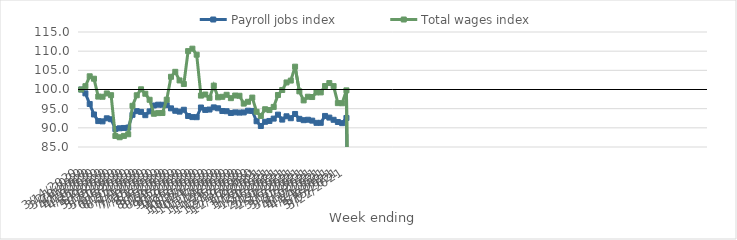
| Category | Payroll jobs index | Total wages index |
|---|---|---|
| 14/03/2020 | 100 | 100 |
| 21/03/2020 | 98.991 | 100.867 |
| 28/03/2020 | 96.222 | 103.446 |
| 04/04/2020 | 93.484 | 102.815 |
| 11/04/2020 | 91.759 | 98.149 |
| 18/04/2020 | 91.688 | 98.106 |
| 25/04/2020 | 92.484 | 98.97 |
| 02/05/2020 | 92.243 | 98.519 |
| 09/05/2020 | 89.688 | 87.883 |
| 16/05/2020 | 89.883 | 87.545 |
| 23/05/2020 | 89.967 | 87.89 |
| 30/05/2020 | 90.07 | 88.321 |
| 06/06/2020 | 93.39 | 95.741 |
| 13/06/2020 | 94.352 | 98.498 |
| 20/06/2020 | 94.165 | 100.051 |
| 27/06/2020 | 93.3 | 98.888 |
| 04/07/2020 | 94.297 | 97.32 |
| 11/07/2020 | 95.822 | 93.671 |
| 18/07/2020 | 96.036 | 93.842 |
| 25/07/2020 | 96.019 | 93.864 |
| 01/08/2020 | 95.918 | 97.336 |
| 08/08/2020 | 95.08 | 103.315 |
| 15/08/2020 | 94.451 | 104.61 |
| 22/08/2020 | 94.231 | 102.366 |
| 29/08/2020 | 94.715 | 101.438 |
| 05/09/2020 | 93.083 | 110.018 |
| 12/09/2020 | 92.801 | 110.647 |
| 19/09/2020 | 92.774 | 109.078 |
| 26/09/2020 | 95.302 | 98.406 |
| 03/10/2020 | 94.674 | 98.692 |
| 10/10/2020 | 94.774 | 97.81 |
| 17/10/2020 | 95.334 | 101.009 |
| 24/10/2020 | 95.1 | 97.95 |
| 31/10/2020 | 94.392 | 98.094 |
| 07/11/2020 | 94.329 | 98.62 |
| 14/11/2020 | 93.874 | 97.741 |
| 21/11/2020 | 94.03 | 98.43 |
| 28/11/2020 | 93.974 | 98.365 |
| 05/12/2020 | 94.02 | 96.321 |
| 12/12/2020 | 94.467 | 96.796 |
| 19/12/2020 | 94.411 | 97.891 |
| 26/12/2020 | 91.723 | 94.184 |
| 02/01/2021 | 90.483 | 93.102 |
| 09/01/2021 | 91.578 | 94.849 |
| 16/01/2021 | 91.791 | 94.631 |
| 23/01/2021 | 92.403 | 95.457 |
| 30/01/2021 | 93.444 | 98.568 |
| 06/02/2021 | 92.149 | 99.874 |
| 13/02/2021 | 93.01 | 101.841 |
| 20/02/2021 | 92.504 | 102.327 |
| 27/02/2021 | 93.614 | 105.956 |
| 06/03/2021 | 92.346 | 99.522 |
| 13/03/2021 | 91.996 | 97.157 |
| 20/03/2021 | 92.113 | 98.115 |
| 27/03/2021 | 91.877 | 98.037 |
| 03/04/2021 | 91.302 | 99.238 |
| 10/04/2021 | 91.302 | 99.238 |
| 17/04/2021 | 93.1 | 100.911 |
| 24/04/2021 | 92.672 | 101.677 |
| 01/05/2021 | 92.097 | 100.881 |
| 08/05/2021 | 91.524 | 96.446 |
| 15/05/2021 | 91.218 | 96.411 |
| 22/05/2021 | 92.571 | 99.772 |